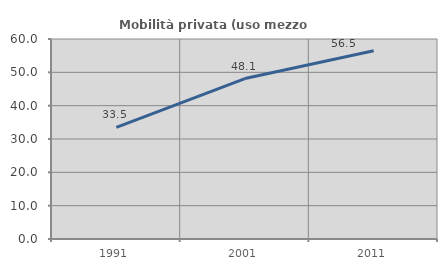
| Category | Mobilità privata (uso mezzo privato) |
|---|---|
| 1991.0 | 33.492 |
| 2001.0 | 48.13 |
| 2011.0 | 56.462 |